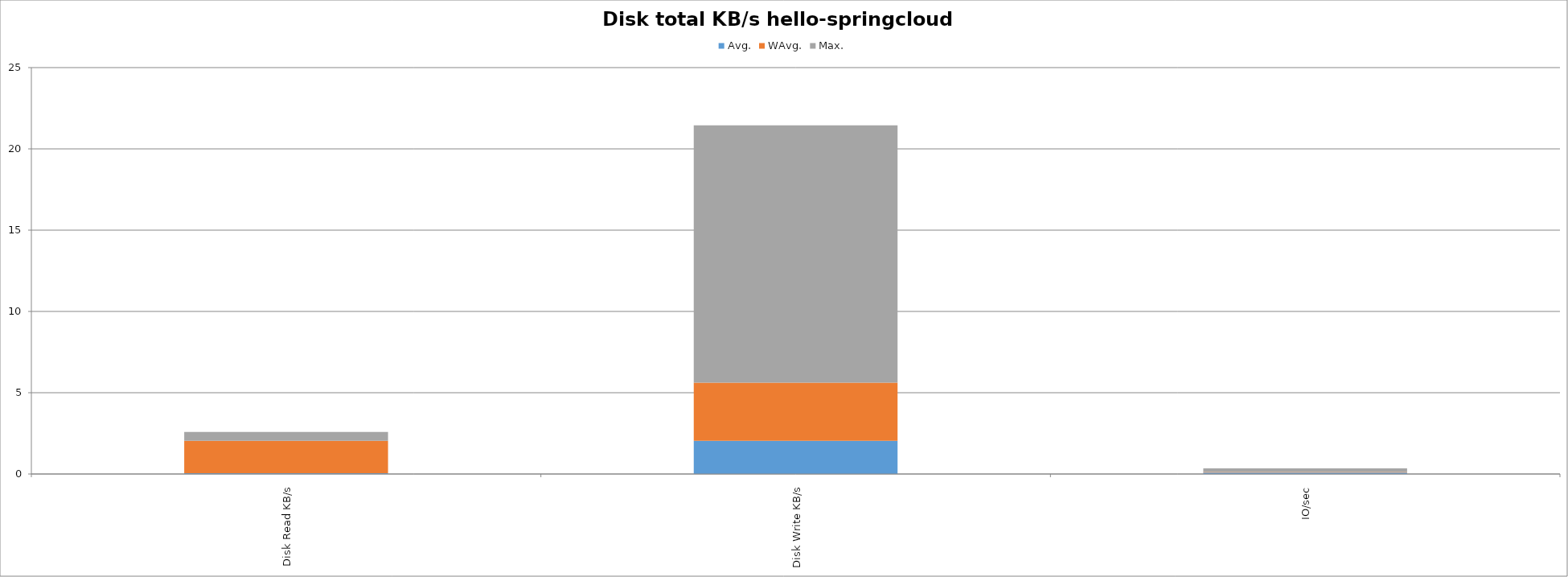
| Category | Avg. | WAvg. | Max. |
|---|---|---|---|
| Disk Read KB/s | 44.585 | 1992.438 | 555.377 |
| Disk Write KB/s | 2043.99 | 3569.123 | 15829.287 |
| IO/sec | 86.805 | 33.945 | 221.65 |